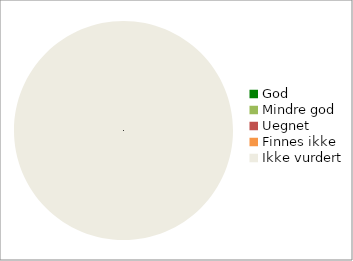
| Category | Series 0 |
|---|---|
| God | 0 |
| Mindre god | 0 |
| Uegnet | 0 |
| Finnes ikke | 0 |
| Ikke vurdert | 86 |